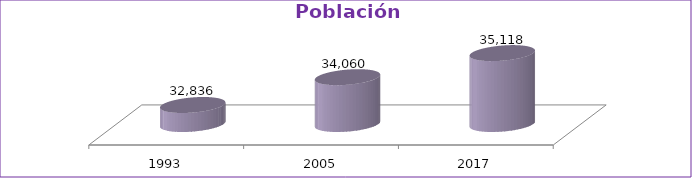
| Category | Población Total |
|---|---|
| 1993 | 32836 |
| 2005 | 34060 |
| 2017 | 35118 |